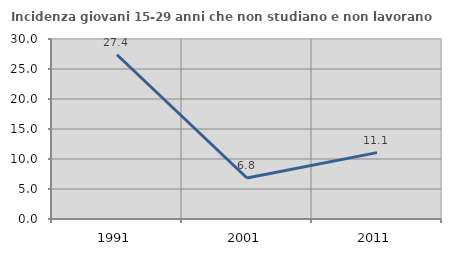
| Category | Incidenza giovani 15-29 anni che non studiano e non lavorano  |
|---|---|
| 1991.0 | 27.381 |
| 2001.0 | 6.828 |
| 2011.0 | 11.06 |